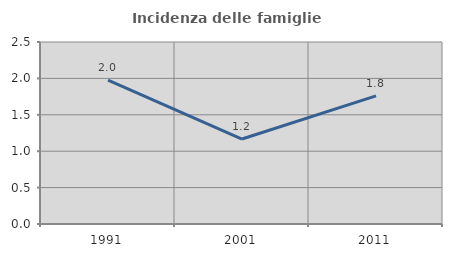
| Category | Incidenza delle famiglie numerose |
|---|---|
| 1991.0 | 1.976 |
| 2001.0 | 1.167 |
| 2011.0 | 1.761 |